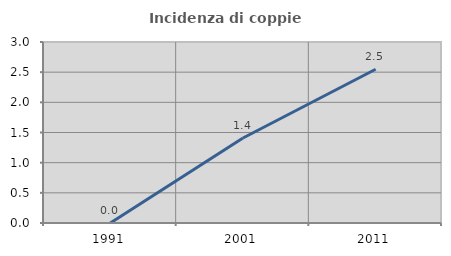
| Category | Incidenza di coppie miste |
|---|---|
| 1991.0 | 0 |
| 2001.0 | 1.408 |
| 2011.0 | 2.548 |